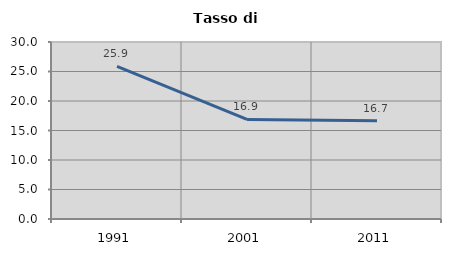
| Category | Tasso di disoccupazione   |
|---|---|
| 1991.0 | 25.881 |
| 2001.0 | 16.872 |
| 2011.0 | 16.667 |